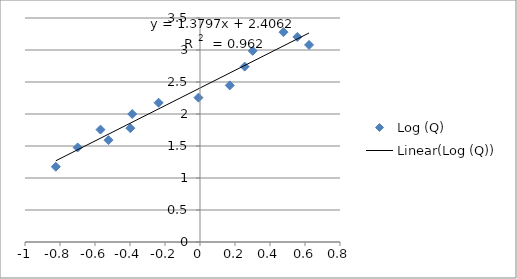
| Category | Log (Q) |
|---|---|
| -0.8239087409443178 | 1.176 |
| -0.6989700043360184 | 1.477 |
| -0.5686362358410134 | 1.756 |
| -0.5228787452803378 | 1.591 |
| -0.3979400086720372 | 1.778 |
| -0.3872161432802644 | 2 |
| -0.23657200643706267 | 2.176 |
| -0.008773924307504954 | 2.255 |
| 0.17026171539495752 | 2.447 |
| 0.25527250510330624 | 2.74 |
| 0.3010299956639812 | 2.987 |
| 0.47712125471966244 | 3.279 |
| 0.5563025007672873 | 3.204 |
| 0.6232492903979003 | 3.079 |